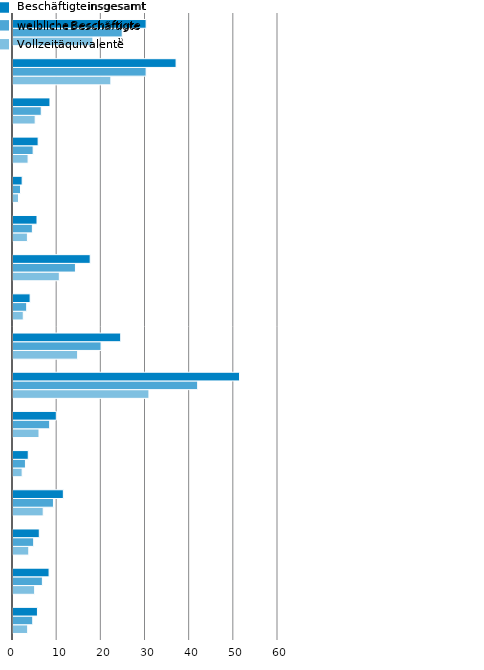
| Category | VZÄ | wB | iB |
|---|---|---|---|
| Thüringen      | 3.322 | 4.471 | 5.536 |
| Schleswig-Holstein | 4.901 | 6.654 | 8.168 |
| Sachsen-Anhalt | 3.573 | 4.681 | 5.954 |
| Sachsen        | 6.841 | 9.162 | 11.402 |
| Saarland | 2.072 | 2.818 | 3.453 |
| Rheinland-Pfalz | 5.885 | 8.302 | 9.809 |
| Nordrhein-Westfalen | 30.778 | 41.809 | 51.297 |
| Niedersachsen | 14.633 | 19.94 | 24.388 |
| Mecklenburg-Vorpommern | 2.326 | 3.102 | 3.876 |
| Hessen         | 10.487 | 14.14 | 17.478 |
| Hamburg | 3.262 | 4.387 | 5.437 |
| Bremen | 1.245 | 1.704 | 2.076 |
| Brandenburg | 3.414 | 4.562 | 5.689 |
| Berlin | 5.021 | 6.394 | 8.368 |
| Bayern | 22.154 | 30.141 | 36.924 |
| Baden-Württemberg | 18.087 | 24.732 | 30.145 |